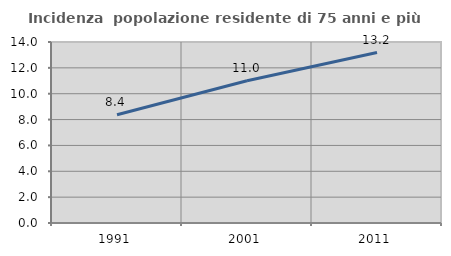
| Category | Incidenza  popolazione residente di 75 anni e più |
|---|---|
| 1991.0 | 8.368 |
| 2001.0 | 11.004 |
| 2011.0 | 13.185 |